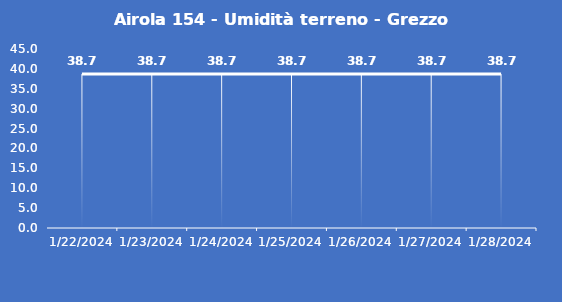
| Category | Airola 154 - Umidità terreno - Grezzo (%VWC) |
|---|---|
| 1/22/24 | 38.7 |
| 1/23/24 | 38.7 |
| 1/24/24 | 38.7 |
| 1/25/24 | 38.7 |
| 1/26/24 | 38.7 |
| 1/27/24 | 38.7 |
| 1/28/24 | 38.7 |